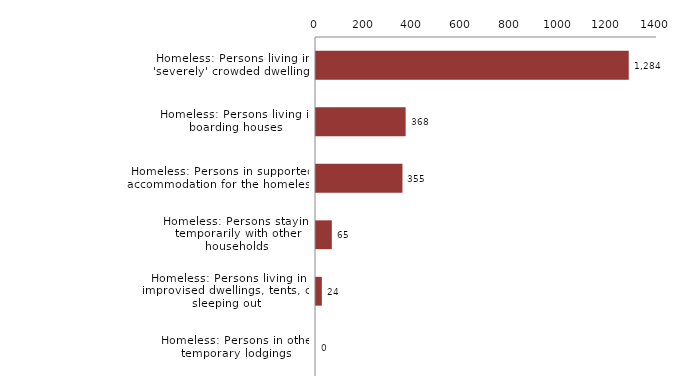
| Category | Series 0 |
|---|---|
| Homeless: Persons living in 'severely' crowded dwellings | 1284 |
| Homeless: Persons living in boarding houses | 368 |
| Homeless: Persons in supported accommodation for the homeless | 355 |
| Homeless: Persons staying temporarily with other households | 65 |
| Homeless: Persons living in improvised dwellings, tents, or sleeping out | 24 |
| Homeless: Persons in other temporary lodgings | 0 |